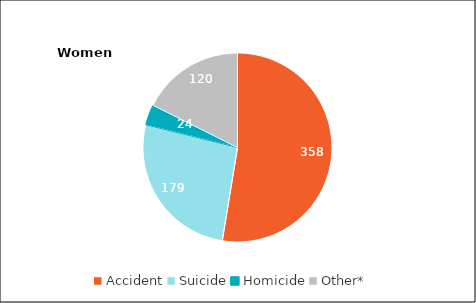
| Category | Women |
|---|---|
| Accident | 358 |
| Suicide | 179 |
| Homicide | 24 |
| Other*  | 120 |